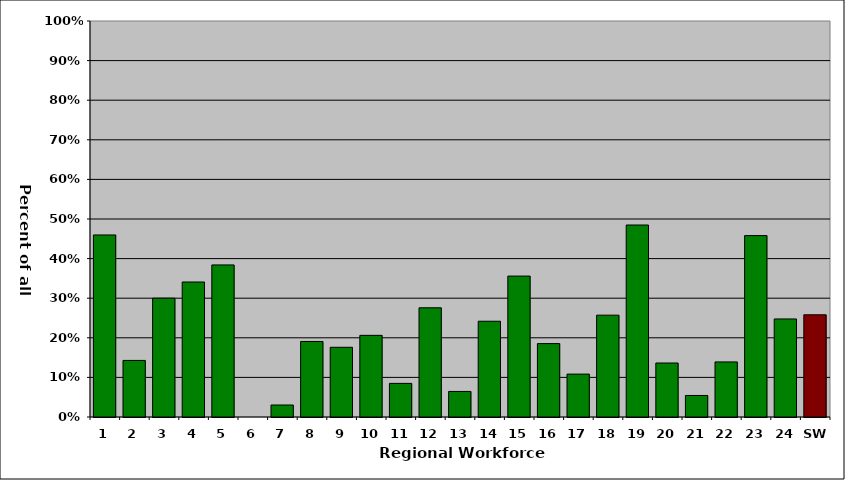
| Category | Series 0 |
|---|---|
| 1 | 0.46 |
| 2 | 0.143 |
| 3 | 0.3 |
| 4 | 0.341 |
| 5 | 0.384 |
| 6 | 0 |
| 7 | 0.03 |
| 8 | 0.191 |
| 9 | 0.176 |
| 10 | 0.206 |
| 11 | 0.085 |
| 12 | 0.276 |
| 13 | 0.065 |
| 14 | 0.242 |
| 15 | 0.356 |
| 16 | 0.185 |
| 17 | 0.108 |
| 18 | 0.257 |
| 19 | 0.485 |
| 20 | 0.136 |
| 21 | 0.054 |
| 22 | 0.139 |
| 23 | 0.458 |
| 24 | 0.248 |
| SW | 0.258 |